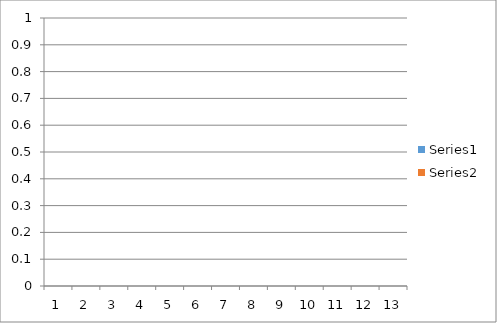
| Category | Series 0 | Series 1 |
|---|---|---|
| 0 | 70 | 70 |
| 1 | 70 | 70 |
| 2 | 70 | 70 |
| 3 | 70 | 69 |
| 4 | 70 | 68 |
| 5 | 70 | 70 |
| 6 | 70 | 70 |
| 7 | 70 | 70 |
| 8 | 70 | 70 |
| 9 | 70 | 71 |
| 10 | 70 | 71 |
| 11 | 75 | 75 |
| 12 | 845 | 844 |